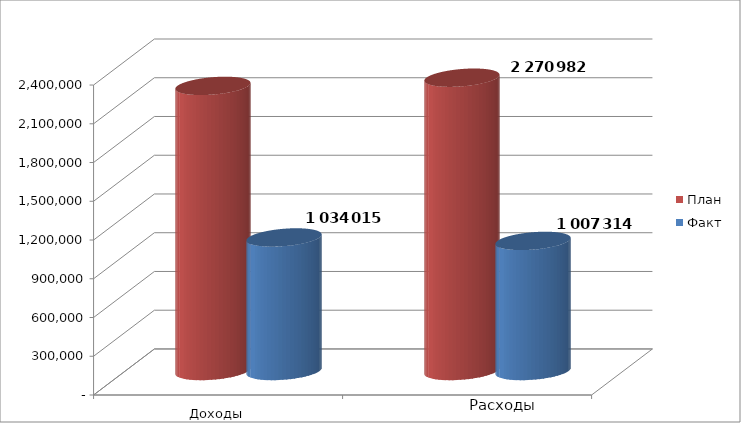
| Category | План | Факт |
|---|---|---|
| 0 | 2207607 | 1034015 |
| 1 | 2270982 | 1007314 |